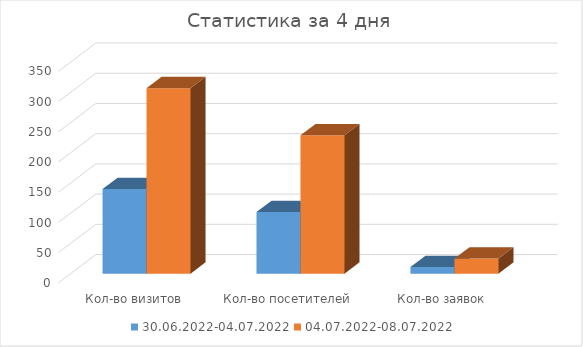
| Category | 30.06.2022-04.07.2022 | 04.07.2022-08.07.2022 |
|---|---|---|
| Кол-во визитов | 140 | 307 |
| Кол-во посетителей | 102 | 229 |
| Кол-во заявок | 11 | 25 |